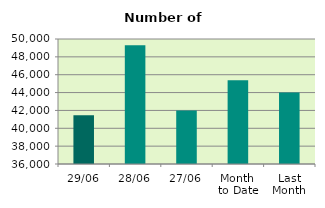
| Category | Series 0 |
|---|---|
| 29/06 | 41448 |
| 28/06 | 49294 |
| 27/06 | 41986 |
| Month 
to Date | 45385.333 |
| Last
Month | 44009.364 |